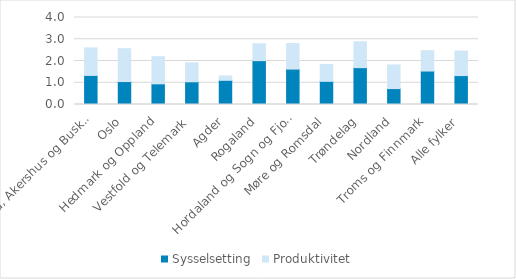
| Category | Sysselsetting | Produktivitet |
|---|---|---|
| Østfold, Akershus og Buskerud | 1.336 | 1.268 |
| Oslo | 1.054 | 1.509 |
| Hedmark og Oppland | 0.951 | 1.247 |
| Vestfold og Telemark | 1.045 | 0.869 |
| Agder | 1.112 | 0.201 |
| Rogaland | 2.016 | 0.776 |
| Hordaland og Sogn og Fjordane | 1.628 | 1.175 |
| Møre og Romsdal | 1.065 | 0.778 |
| Trøndelag | 1.694 | 1.191 |
| Nordland | 0.732 | 1.086 |
| Troms og Finnmark | 1.538 | 0.935 |
| Alle fylker | 1.329 | 1.128 |